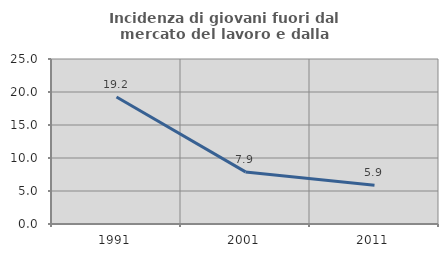
| Category | Incidenza di giovani fuori dal mercato del lavoro e dalla formazione  |
|---|---|
| 1991.0 | 19.231 |
| 2001.0 | 7.895 |
| 2011.0 | 5.882 |